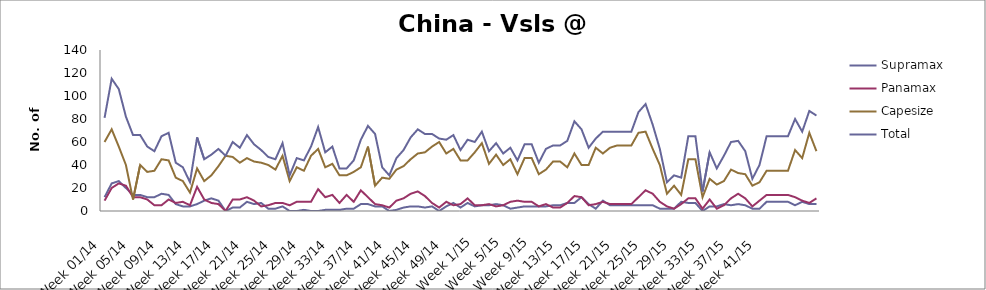
| Category | Supramax | Panamax | Capesize | Total |
|---|---|---|---|---|
| Week 01/14 | 12 | 9 | 60 | 81 |
| Week 02/14 | 24 | 20 | 71 | 115 |
| Week 03/14 | 26 | 24 | 56 | 106 |
| Week 04/14 | 20 | 22 | 40 | 82 |
| Week 05/14 | 14 | 12 | 10 | 66 |
| Week 06/14 | 14 | 12 | 40 | 66 |
| Week 07/14 | 12 | 10 | 34 | 56 |
| Week 08/14 | 12 | 5 | 35 | 52 |
| Week 09/14 | 15 | 5 | 45 | 65 |
| Week 10/14 | 14 | 10 | 44 | 68 |
| Week 11/14 | 6 | 7 | 29 | 42 |
| Week 12/14 | 4 | 8 | 26 | 38 |
| Week 13/14 | 4 | 5 | 16 | 25 |
| Week 14/14 | 6 | 21 | 37 | 64 |
| Week 15/14 | 9 | 10 | 26 | 45 |
| Week 16/14 | 11 | 7 | 31 | 49 |
| Week 17/14 | 9 | 6 | 39 | 54 |
| Week 18/14 | 0 | 0 | 48 | 48 |
| Week 19/14 | 3 | 10 | 47 | 60 |
| Week 20/14 | 3 | 10 | 42 | 55 |
| Week 21/14 | 8 | 12 | 46 | 66 |
| Week 22/14 | 6 | 9 | 43 | 58 |
| Week 23/14 | 7 | 4 | 42 | 53 |
| Week 24/14 | 2 | 5 | 40 | 47 |
| Week 25/14 | 2 | 7 | 36 | 45 |
| Week 26/14 | 4 | 7 | 48 | 59 |
| Week 27/14 | 0 | 5 | 26 | 31 |
| Week 28/14 | 0 | 8 | 38 | 46 |
| Week 29/14 | 1 | 8 | 35 | 44 |
| Week 30/14 | 0 | 8 | 48 | 56 |
| Week 31/14 | 0 | 19 | 54 | 73 |
| Week 32/14 | 1 | 12 | 38 | 51 |
| Week 33/14 | 1 | 14 | 41 | 56 |
| Week 34/14 | 1 | 7 | 31 | 37 |
| Week 35/14 | 2 | 14 | 31 | 37 |
| Week 36/14 | 2 | 8 | 34 | 44 |
| Week 37/14 | 6 | 18 | 38 | 62 |
| Week 38/14 | 6 | 12 | 56 | 74 |
| Week 39/14 | 4 | 6 | 22 | 67 |
| Week 40/14 | 4 | 5 | 29 | 38 |
| Week 41/14 | 0 | 3 | 28 | 31 |
| Week 42/14 | 1 | 9 | 36 | 46 |
| Week 43/14 | 3 | 11 | 39 | 53 |
| Week 44/14 | 4 | 15 | 45 | 64 |
| Week 45/14 | 4 | 17 | 50 | 71 |
| Week 46/14 | 3 | 13 | 51 | 67 |
| Week 47/14 | 4 | 7 | 56 | 67 |
| Week 48/14 | 0 | 3 | 60 | 63 |
| Week 49/14 | 4 | 8 | 50 | 62 |
| Week 50/14 | 7 | 5 | 54 | 66 |
| Week 51/14 | 3 | 6 | 44 | 53 |
| Week 52/14 | 7 | 11 | 44 | 62 |
| Week 1/15 | 4 | 5 | 51 | 60 |
| Week 2/15 | 5 | 5 | 59 | 69 |
| Week 3/15 | 5 | 6 | 41 | 52 |
| Week 4/15 | 6 | 4 | 49 | 59 |
| Week 5/15 | 5 | 5 | 40 | 50 |
| Week 6/15 | 2 | 8 | 45 | 55 |
| Week 7/15 | 3 | 9 | 32 | 44 |
| Week 8/15 | 4 | 8 | 46 | 58 |
| Week 9/15 | 4 | 8 | 46 | 58 |
| Week 10/15 | 4 | 4 | 32 | 42 |
| Week 11/15 | 4 | 6 | 36 | 54 |
| Week 12/15 | 5 | 3 | 43 | 57 |
| Week 13/15 | 5 | 3 | 43 | 57 |
| Week 14/15 | 7 | 7 | 38 | 61 |
| Week 15/15 | 7 | 13 | 50 | 78 |
| Week 16/15 | 12 | 12 | 40 | 71 |
| Week 17/15 | 6 | 5 | 40 | 55 |
| Week 18/15 | 2 | 6 | 55 | 63 |
| Week 19/15 | 9 | 8 | 50 | 69 |
| Week 20/15 | 5 | 6 | 55 | 69 |
| Week 21/15 | 5 | 6 | 57 | 69 |
| Week 22/15 | 5 | 6 | 57 | 69 |
| Week 23/15 | 5 | 6 | 57 | 69 |
| Week 24/15 | 5 | 12 | 68 | 86 |
| Week 25/15 | 5 | 18 | 69 | 93 |
| Week 26/15 | 5 | 15 | 54 | 75 |
| Week 27/15 | 2 | 8 | 40 | 54 |
| Week 28/15 | 2 | 4 | 15 | 25 |
| Week 29/15 | 2 | 2 | 22 | 31 |
| Week 30/15 | 8 | 6 | 14 | 29 |
| Week 31/15 | 7 | 11 | 45 | 65 |
| Week 32/15 | 7 | 11 | 45 | 65 |
| Week 33/15 | 0 | 2 | 12 | 17 |
| Week 34/15 | 4 | 10 | 28 | 51 |
| Week 35/15 | 4 | 2 | 23 | 37 |
| Week 36/15 | 6 | 5 | 26 | 48 |
| Week 37/15 | 5 | 11 | 36 | 60 |
| Week 38/15 | 6 | 15 | 33 | 61 |
| Week 39/15 | 5 | 11 | 32 | 52 |
| Week 40/15 | 2 | 4 | 22 | 28 |
| Week 41/15 | 2 | 9 | 25 | 40 |
| Week 42/15 | 8 | 14 | 35 | 65 |